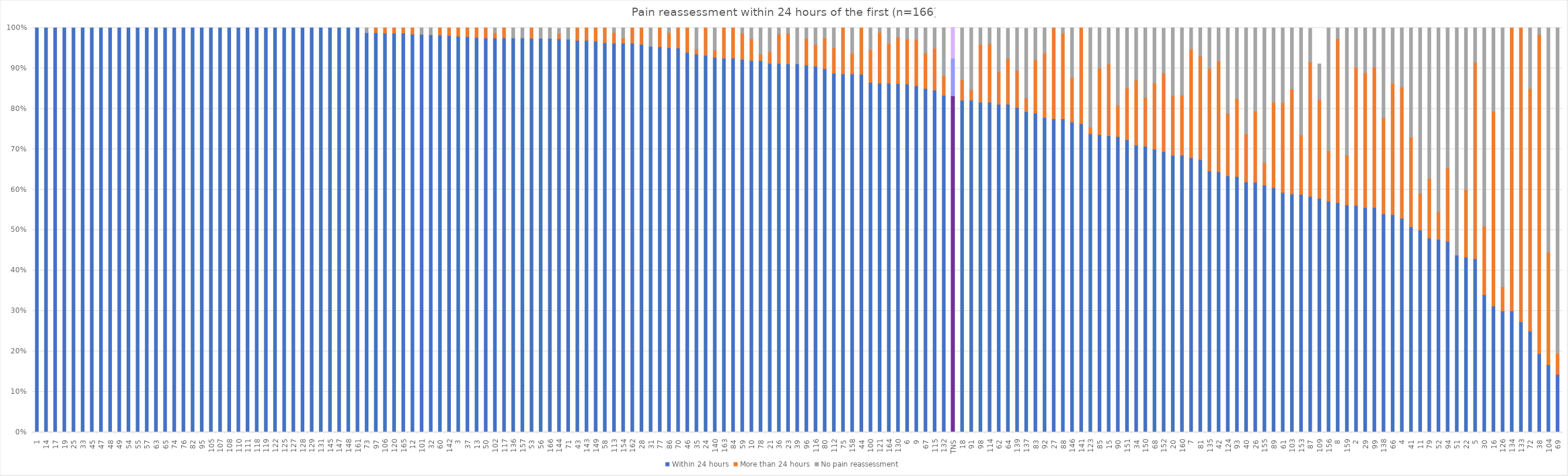
| Category | Within 24 hours | More than 24 hours | No pain reassessment |
|---|---|---|---|
| 1 | 1 | 0 | 0 |
| 14 | 1 | 0 | 0 |
| 17 | 1 | 0 | 0 |
| 19 | 1 | 0 | 0 |
| 25 | 1 | 0 | 0 |
| 33 | 1 | 0 | 0 |
| 45 | 1 | 0 | 0 |
| 47 | 1 | 0 | 0 |
| 48 | 1 | 0 | 0 |
| 49 | 1 | 0 | 0 |
| 54 | 1 | 0 | 0 |
| 55 | 1 | 0 | 0 |
| 57 | 1 | 0 | 0 |
| 63 | 1 | 0 | 0 |
| 65 | 1 | 0 | 0 |
| 74 | 1 | 0 | 0 |
| 76 | 1 | 0 | 0 |
| 82 | 1 | 0 | 0 |
| 95 | 1 | 0 | 0 |
| 105 | 1 | 0 | 0 |
| 107 | 1 | 0 | 0 |
| 108 | 1 | 0 | 0 |
| 110 | 1 | 0 | 0 |
| 111 | 1 | 0 | 0 |
| 118 | 1 | 0 | 0 |
| 119 | 1 | 0 | 0 |
| 122 | 1 | 0 | 0 |
| 125 | 1 | 0 | 0 |
| 127 | 1 | 0 | 0 |
| 128 | 1 | 0 | 0 |
| 129 | 1 | 0 | 0 |
| 131 | 1 | 0 | 0 |
| 145 | 1 | 0 | 0 |
| 147 | 1 | 0 | 0 |
| 148 | 1 | 0 | 0 |
| 161 | 1 | 0 | 0 |
| 73 | 0.988 | 0 | 0.013 |
| 97 | 0.988 | 0.013 | 0 |
| 106 | 0.987 | 0.013 | 0 |
| 120 | 0.987 | 0.013 | 0 |
| 165 | 0.987 | 0.013 | 0 |
| 12 | 0.984 | 0.016 | 0 |
| 101 | 0.984 | 0 | 0.016 |
| 32 | 0.983 | 0 | 0.017 |
| 60 | 0.982 | 0.018 | 0 |
| 142 | 0.981 | 0.019 | 0 |
| 3 | 0.979 | 0.021 | 0 |
| 37 | 0.978 | 0.022 | 0 |
| 13 | 0.976 | 0.024 | 0 |
| 50 | 0.975 | 0.025 | 0 |
| 102 | 0.975 | 0.013 | 0.013 |
| 117 | 0.975 | 0.025 | 0 |
| 136 | 0.975 | 0 | 0.025 |
| 157 | 0.975 | 0 | 0.025 |
| 53 | 0.974 | 0.026 | 0 |
| 56 | 0.974 | 0 | 0.026 |
| 166 | 0.974 | 0 | 0.026 |
| 144 | 0.973 | 0.013 | 0.013 |
| 71 | 0.972 | 0 | 0.028 |
| 43 | 0.969 | 0.031 | 0 |
| 143 | 0.969 | 0.031 | 0 |
| 149 | 0.967 | 0.033 | 0 |
| 58 | 0.963 | 0.038 | 0 |
| 113 | 0.962 | 0.026 | 0.013 |
| 154 | 0.962 | 0.013 | 0.026 |
| 162 | 0.962 | 0.038 | 0 |
| 28 | 0.959 | 0.041 | 0 |
| 31 | 0.954 | 0 | 0.046 |
| 77 | 0.953 | 0.047 | 0 |
| 86 | 0.951 | 0.037 | 0.012 |
| 70 | 0.95 | 0.05 | 0 |
| 46 | 0.939 | 0.061 | 0 |
| 35 | 0.935 | 0.013 | 0.052 |
| 24 | 0.932 | 0.068 | 0 |
| 140 | 0.927 | 0.018 | 0.055 |
| 163 | 0.925 | 0.075 | 0 |
| 84 | 0.925 | 0.075 | 0 |
| 59 | 0.922 | 0.065 | 0.013 |
| 10 | 0.919 | 0.054 | 0.027 |
| 78 | 0.919 | 0.016 | 0.065 |
| 21 | 0.912 | 0.029 | 0.059 |
| 36 | 0.912 | 0.074 | 0.015 |
| 23 | 0.911 | 0.076 | 0.013 |
| 39 | 0.911 | 0 | 0.089 |
| 96 | 0.908 | 0.066 | 0.026 |
| 116 | 0.905 | 0.054 | 0.041 |
| 80 | 0.899 | 0.076 | 0.025 |
| 112 | 0.888 | 0.063 | 0.05 |
| 75 | 0.886 | 0.114 | 0 |
| 158 | 0.886 | 0.051 | 0.063 |
| 44 | 0.885 | 0.115 | 0 |
| 100 | 0.865 | 0.081 | 0.054 |
| 121 | 0.863 | 0.125 | 0.013 |
| 164 | 0.863 | 0.098 | 0.039 |
| 130 | 0.862 | 0.115 | 0.023 |
| 6 | 0.861 | 0.111 | 0.028 |
| 9 | 0.857 | 0.114 | 0.029 |
| 67 | 0.85 | 0.088 | 0.063 |
| 115 | 0.846 | 0.103 | 0.051 |
| 132 | 0.833 | 0.048 | 0.119 |
| TNS | 0.831 | 0.093 | 0.076 |
| 18 | 0.821 | 0.051 | 0.128 |
| 91 | 0.821 | 0.026 | 0.154 |
| 98 | 0.816 | 0.143 | 0.041 |
| 114 | 0.816 | 0.145 | 0.039 |
| 62 | 0.811 | 0.081 | 0.108 |
| 64 | 0.811 | 0.113 | 0.075 |
| 139 | 0.803 | 0.092 | 0.105 |
| 137 | 0.793 | 0.034 | 0.172 |
| 83 | 0.789 | 0.132 | 0.079 |
| 92 | 0.778 | 0.159 | 0.063 |
| 27 | 0.775 | 0.225 | 0 |
| 88 | 0.775 | 0.211 | 0.014 |
| 146 | 0.767 | 0.11 | 0.123 |
| 141 | 0.763 | 0.238 | 0 |
| 123 | 0.738 | 0.016 | 0.246 |
| 85 | 0.736 | 0.165 | 0.099 |
| 15 | 0.733 | 0.178 | 0.089 |
| 90 | 0.731 | 0.077 | 0.192 |
| 151 | 0.723 | 0.128 | 0.149 |
| 34 | 0.71 | 0.161 | 0.129 |
| 150 | 0.707 | 0.121 | 0.172 |
| 68 | 0.7 | 0.163 | 0.138 |
| 152 | 0.694 | 0.194 | 0.111 |
| 20 | 0.685 | 0.148 | 0.167 |
| 160 | 0.685 | 0.148 | 0.167 |
| 7 | 0.679 | 0.268 | 0.054 |
| 81 | 0.674 | 0.256 | 0.07 |
| 135 | 0.646 | 0.253 | 0.101 |
| 42 | 0.644 | 0.274 | 0.082 |
| 124 | 0.634 | 0.155 | 0.211 |
| 93 | 0.632 | 0.193 | 0.175 |
| 40 | 0.619 | 0.119 | 0.262 |
| 26 | 0.618 | 0.176 | 0.206 |
| 155 | 0.611 | 0.056 | 0.333 |
| 89 | 0.605 | 0.211 | 0.184 |
| 61 | 0.593 | 0.222 | 0.185 |
| 103 | 0.589 | 0.26 | 0.151 |
| 153 | 0.588 | 0.147 | 0.265 |
| 87 | 0.583 | 0.333 | 0.083 |
| 109 | 0.578 | 0.244 | 0.089 |
| 156 | 0.571 | 0.125 | 0.304 |
| 8 | 0.568 | 0.405 | 0.027 |
| 159 | 0.562 | 0.123 | 0.315 |
| 2 | 0.561 | 0.341 | 0.098 |
| 29 | 0.556 | 0.333 | 0.111 |
| 99 | 0.556 | 0.347 | 0.097 |
| 138 | 0.54 | 0.238 | 0.222 |
| 66 | 0.538 | 0.325 | 0.138 |
| 4 | 0.529 | 0.324 | 0.147 |
| 41 | 0.508 | 0.222 | 0.27 |
| 11 | 0.5 | 0.091 | 0.409 |
| 79 | 0.48 | 0.147 | 0.373 |
| 52 | 0.477 | 0.068 | 0.455 |
| 94 | 0.472 | 0.181 | 0.347 |
| 51 | 0.438 | 0 | 0.563 |
| 22 | 0.433 | 0.167 | 0.4 |
| 5 | 0.429 | 0.486 | 0.086 |
| 30 | 0.34 | 0.17 | 0.491 |
| 16 | 0.312 | 0.481 | 0.208 |
| 126 | 0.3 | 0.06 | 0.64 |
| 134 | 0.3 | 0.7 | 0 |
| 133 | 0.273 | 0.727 | 0 |
| 72 | 0.25 | 0.6 | 0.15 |
| 38 | 0.194 | 0.79 | 0.016 |
| 104 | 0.167 | 0.278 | 0.556 |
| 69 | 0.143 | 0.052 | 0.805 |